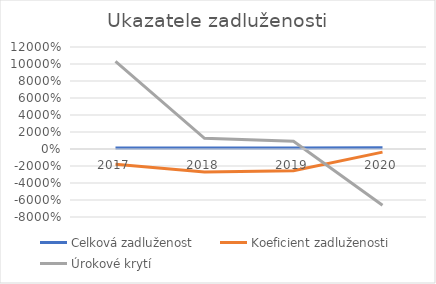
| Category | Celková zadluženost | Koeficient zadluženosti | Úrokové krytí |
|---|---|---|---|
| 2017.0 | 1.059 | -18.063 | 102.971 |
| 2018.0 | 1.038 | -27.066 | 12.593 |
| 2019.0 | 1.042 | -25.515 | 9.134 |
| 2020.0 | 1.379 | -3.639 | -66.097 |